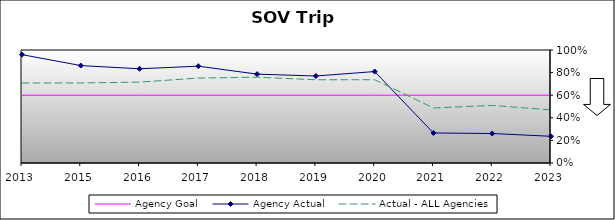
| Category | Agency Goal | Agency Actual | Actual - ALL Agencies |
|---|---|---|---|
| 2013.0 | 0.6 | 0.959 | 0.708 |
| 2015.0 | 0.6 | 0.862 | 0.708 |
| 2016.0 | 0.6 | 0.834 | 0.716 |
| 2017.0 | 0.6 | 0.857 | 0.752 |
| 2018.0 | 0.6 | 0.786 | 0.759 |
| 2019.0 | 0.6 | 0.77 | 0.736 |
| 2020.0 | 0.6 | 0.809 | 0.737 |
| 2021.0 | 0.6 | 0.266 | 0.487 |
| 2022.0 | 0.6 | 0.261 | 0.509 |
| 2023.0 | 0.6 | 0.236 | 0.47 |